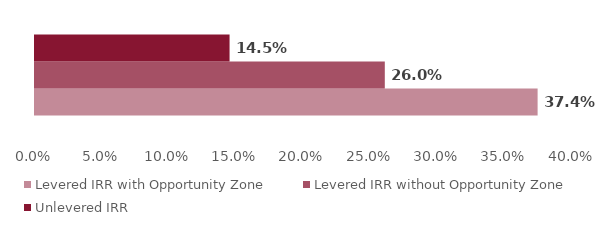
| Category | Levered IRR with Opportunity Zone | Levered IRR without Opportunity Zone | Unlevered IRR |
|---|---|---|---|
| 0 | 0.374 | 0.26 | 0.145 |